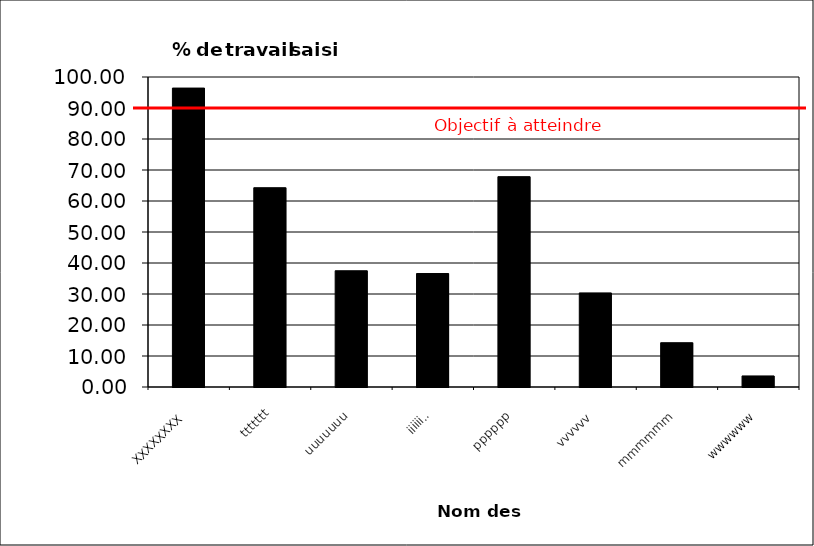
| Category | Series 0 |
|---|---|
| XXXXXXXX | 96.429 |
| ttttttt | 64.286 |
| uuuuuuu | 37.5 |
| iiiiiiii | 36.607 |
| pppppp | 67.857 |
| vvvvvv | 30.357 |
| mmmmmm | 14.286 |
| wwwwww | 3.571 |